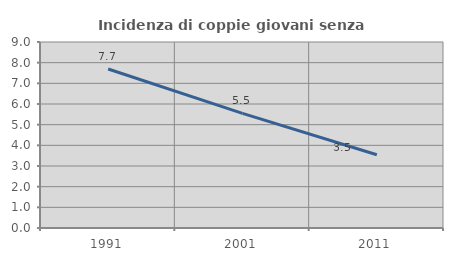
| Category | Incidenza di coppie giovani senza figli |
|---|---|
| 1991.0 | 7.692 |
| 2001.0 | 5.544 |
| 2011.0 | 3.542 |